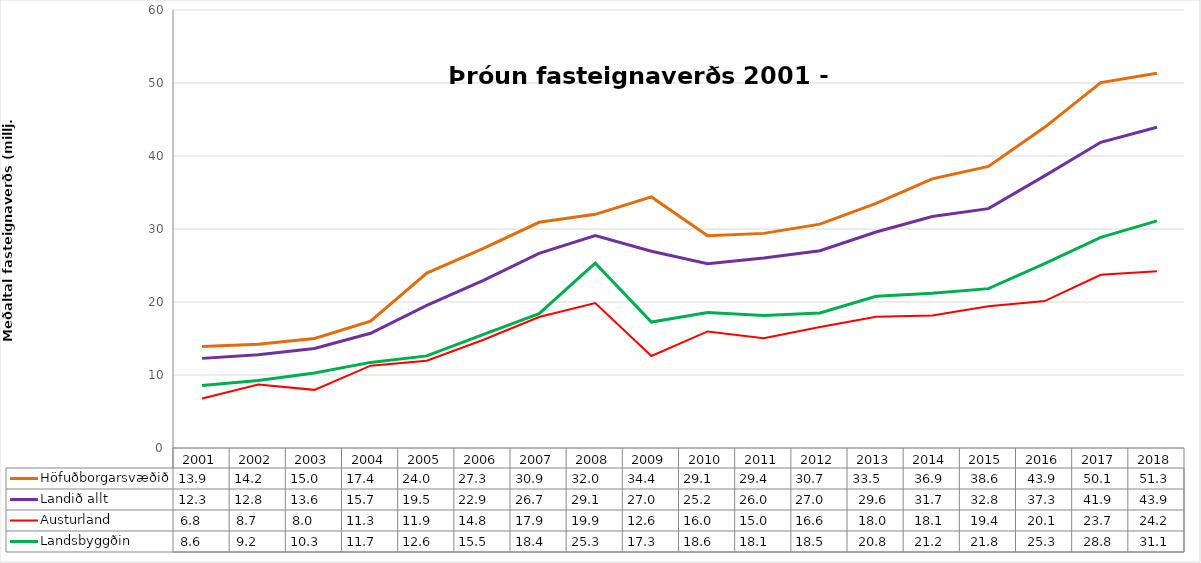
| Category | Höfuðborgarsvæðið | Landið allt | Austurland | Landsbyggðin |
|---|---|---|---|---|
| 2001.0 | 13.895 | 12.277 | 6.788 | 8.57 |
| 2002.0 | 14.22 | 12.763 | 8.704 | 9.241 |
| 2003.0 | 15.011 | 13.625 | 7.964 | 10.279 |
| 2004.0 | 17.376 | 15.712 | 11.28 | 11.728 |
| 2005.0 | 23.969 | 19.527 | 11.944 | 12.618 |
| 2006.0 | 27.298 | 22.935 | 14.789 | 15.532 |
| 2007.0 | 30.92 | 26.671 | 17.943 | 18.395 |
| 2008.0 | 32.01 | 29.115 | 19.866 | 25.327 |
| 2009.0 | 34.392 | 26.955 | 12.603 | 17.254 |
| 2010.0 | 29.062 | 25.248 | 15.969 | 18.564 |
| 2011.0 | 29.4 | 26.039 | 15.027 | 18.134 |
| 2012.0 | 30.67 | 27.027 | 16.58 | 18.485 |
| 2013.0 | 33.499 | 29.585 | 17.989 | 20.78 |
| 2014.0 | 36.863 | 31.703 | 18.146 | 21.213 |
| 2015.0 | 38.572 | 32.793 | 19.409 | 21.831 |
| 2016.0 | 43.925 | 37.28 | 20.122 | 25.268 |
| 2017.0 | 50.058 | 41.88 | 23.736 | 28.845 |
| 2018.0 | 51.337 | 43.93 | 24.224 | 31.113 |